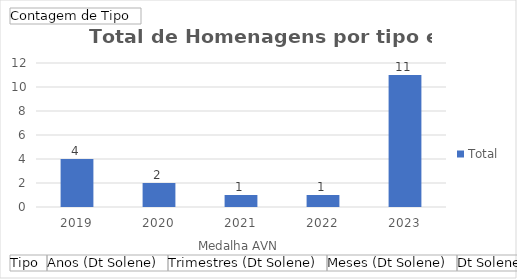
| Category | Total |
|---|---|
| 0 | 4 |
| 1 | 2 |
| 2 | 1 |
| 3 | 1 |
| 4 | 11 |